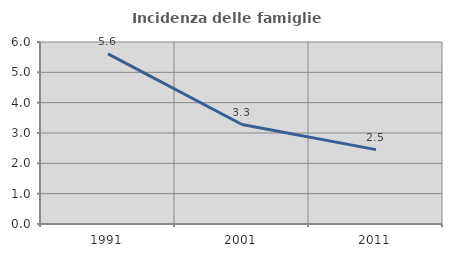
| Category | Incidenza delle famiglie numerose |
|---|---|
| 1991.0 | 5.608 |
| 2001.0 | 3.28 |
| 2011.0 | 2.452 |